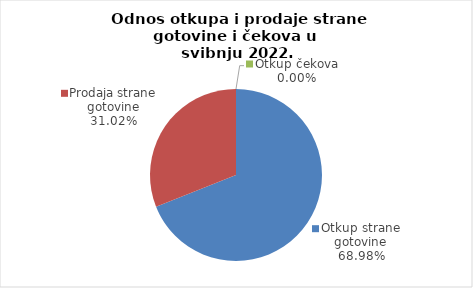
| Category | Series 0 |
|---|---|
| Otkup strane gotovine | 68.98 |
| Prodaja strane gotovine | 31.02 |
| Otkup čekova | 0 |